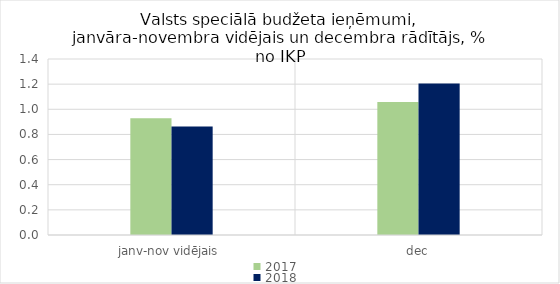
| Category | 2017 | 2018 |
|---|---|---|
| janv-nov vidējais | 0.93 | 0.863 |
| dec | 1.058 | 1.205 |